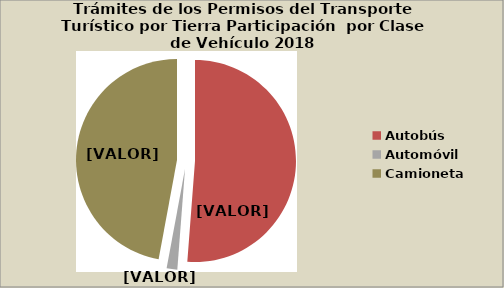
| Category | Series 0 |
|---|---|
| Autobús | 51.241 |
| Automóvil | 1.7 |
| Camioneta | 47.111 |